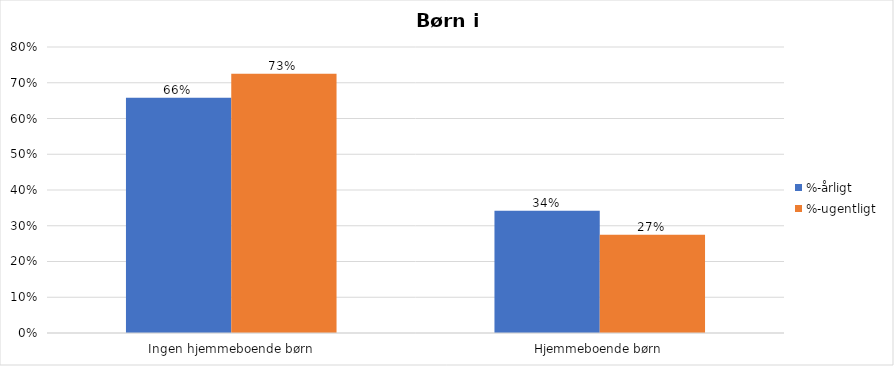
| Category | %-årligt | %-ugentligt |
|---|---|---|
| Ingen hjemmeboende børn | 0.658 | 0.725 |
| Hjemmeboende børn | 0.342 | 0.275 |